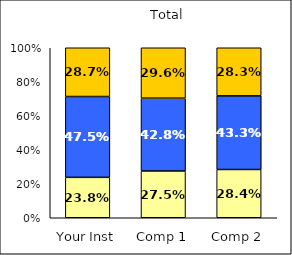
| Category | Low Academic Self-Concept | Average Academic Self-Concept | High Academic Self-Concept |
|---|---|---|---|
| Your Inst | 0.238 | 0.475 | 0.287 |
| Comp 1 | 0.275 | 0.428 | 0.296 |
| Comp 2 | 0.284 | 0.433 | 0.283 |